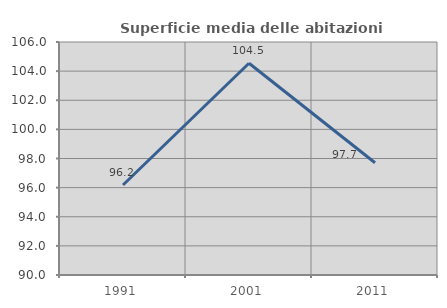
| Category | Superficie media delle abitazioni occupate |
|---|---|
| 1991.0 | 96.18 |
| 2001.0 | 104.542 |
| 2011.0 | 97.705 |